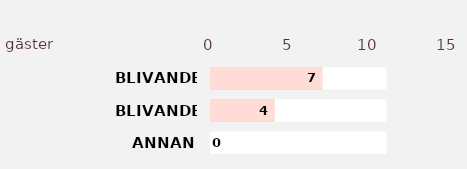
| Category | Series 2 | Series 3 | Series 1 | Series 0 |
|---|---|---|---|---|
| ANNAN | 11 | 0 | 11 | 0 |
| BLIVANDE MAKE/MAKA 2 | 11 | 4 | 11 | 4 |
| BLIVANDE MAKE/MAKA 1 | 11 | 7 | 11 | 7 |